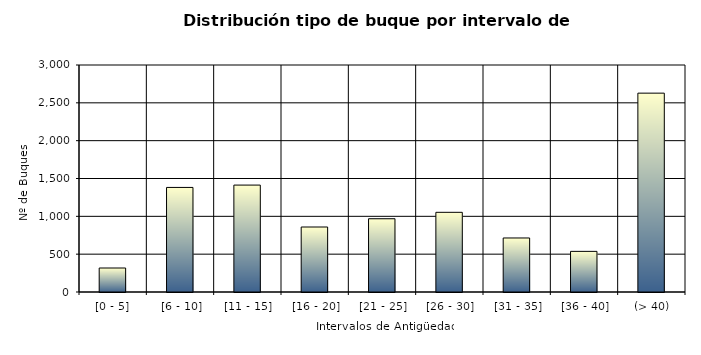
| Category | Series 0 |
|---|---|
| [0 - 5] | 317 |
|  [6 - 10] | 1382 |
|  [11 - 15] | 1413 |
|  [16 - 20] | 859 |
|  [21 - 25] | 968 |
|  [26 - 30] | 1053 |
|  [31 - 35] | 714 |
|  [36 - 40] | 537 |
|  (> 40) | 2628 |